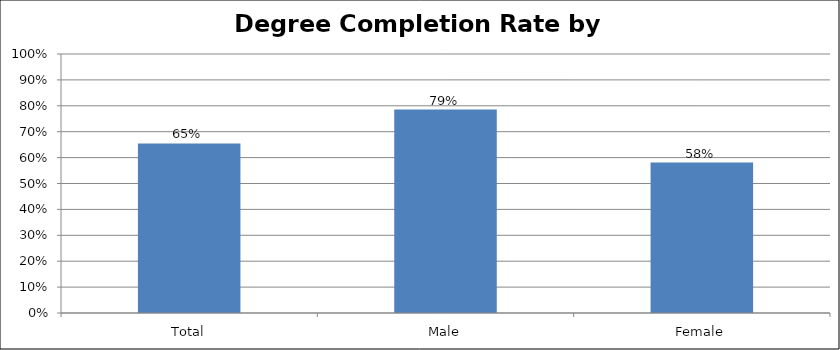
| Category | Completion Rates by Gender |
|---|---|
| Total | 0.655 |
| Male | 0.786 |
| Female | 0.581 |